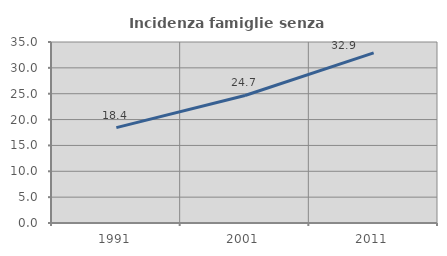
| Category | Incidenza famiglie senza nuclei |
|---|---|
| 1991.0 | 18.441 |
| 2001.0 | 24.656 |
| 2011.0 | 32.892 |